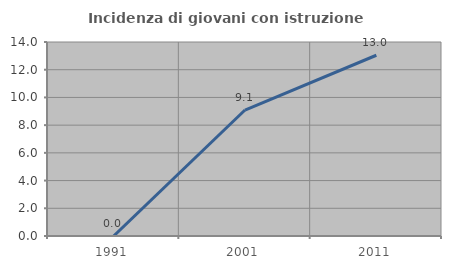
| Category | Incidenza di giovani con istruzione universitaria |
|---|---|
| 1991.0 | 0 |
| 2001.0 | 9.091 |
| 2011.0 | 13.043 |